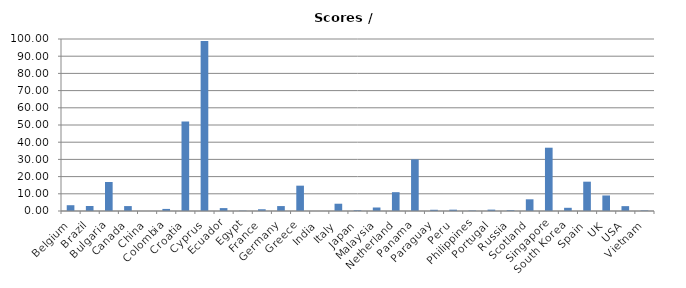
| Category | Series 0 |
|---|---|
| Belgium | 3.364 |
| Brazil | 2.917 |
| Bulgaria | 16.857 |
| Canada | 2.861 |
| China | 0.002 |
| Colombia | 1.208 |
| Croatia | 52 |
| Cyprus | 98.889 |
| Ecuador | 1.688 |
| Egypt | 0.18 |
| France | 1.015 |
| Germany | 2.864 |
| Greece | 14.727 |
| India | 0.008 |
| Italy | 4.23 |
| Japan | 0.417 |
| Malaysia | 2.032 |
| Netherland | 10.941 |
| Panama | 30 |
| Paraguay | 0.714 |
| Peru | 0.774 |
| Philippines | 0.255 |
| Portugal | 0.8 |
| Russia | 0.442 |
| Scotland | 6.8 |
| Singapore | 36.8 |
| South Korea | 1.863 |
| Spain | 17.043 |
| UK | 9.031 |
| USA | 2.823 |
| Vietnam | 0.315 |